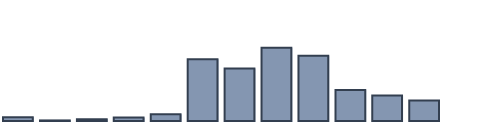
| Category | Series 0 |
|---|---|
| 0 | 1.069 |
| 1 | 0.167 |
| 2 | 0.535 |
| 3 | 1.002 |
| 4 | 1.949 |
| 5 | 17.841 |
| 6 | 15.17 |
| 7 | 21.199 |
| 8 | 18.859 |
| 9 | 8.957 |
| 10 | 7.356 |
| 11 | 5.895 |
| 12 | 0 |